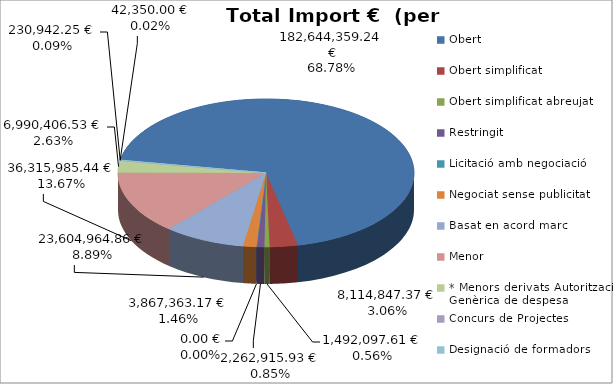
| Category | Total preu              (amb iva) |
|---|---|
| Obert | 182644359.24 |
| Obert simplificat | 8114847.37 |
| Obert simplificat abreujat | 1492097.61 |
| Restringit | 2262915.93 |
| Licitació amb negociació | 0 |
| Negociat sense publicitat | 3867363.17 |
| Basat en acord marc | 23604964.86 |
| Menor | 36315985.44 |
| * Menors derivats Autorització Genèrica de despesa | 6990406.53 |
| Concurs de Projectes | 42350 |
| Designació de formadors | 230942.25 |